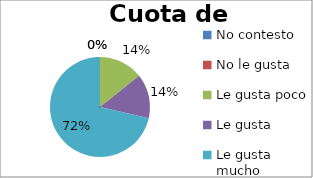
| Category | Series 2 | Series 1 | Series 0 |
|---|---|---|---|
| No contesto | 0 |  | 0 |
| No le gusta | 0 |  | 0 |
| Le gusta poco | 14.286 |  | 1 |
| Le gusta | 14.286 |  | 1 |
| Le gusta mucho | 71.429 |  | 5 |